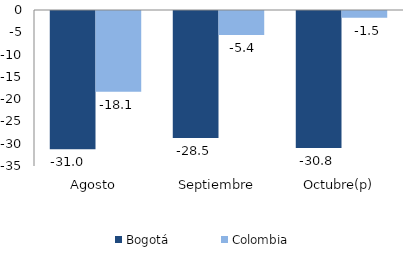
| Category | Bogotá | Colombia |
|---|---|---|
| Agosto | -30.999 | -18.089 |
| Septiembre | -28.491 | -5.409 |
| Octubre(p) | -30.762 | -1.54 |